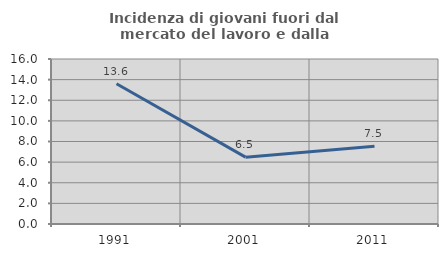
| Category | Incidenza di giovani fuori dal mercato del lavoro e dalla formazione  |
|---|---|
| 1991.0 | 13.603 |
| 2001.0 | 6.481 |
| 2011.0 | 7.538 |